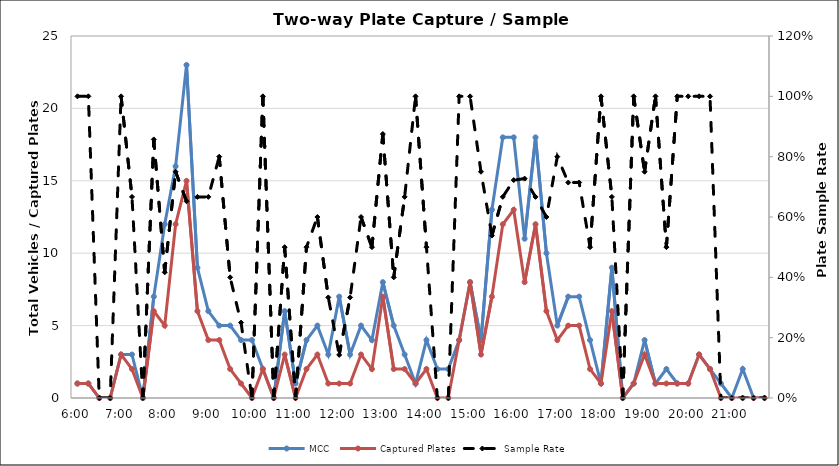
| Category | MCC | Captured Plates |
|---|---|---|
| 0.25 | 1 | 1 |
| 0.260416666666667 | 1 | 1 |
| 0.270833333333333 | 0 | 0 |
| 0.28125 | 0 | 0 |
| 0.291666666666667 | 3 | 3 |
| 0.302083333333333 | 3 | 2 |
| 0.3125 | 0 | 0 |
| 0.322916666666667 | 7 | 6 |
| 0.333333333333333 | 12 | 5 |
| 0.34375 | 16 | 12 |
| 0.354166666666667 | 23 | 15 |
| 0.364583333333333 | 9 | 6 |
| 0.375 | 6 | 4 |
| 0.385416666666667 | 5 | 4 |
| 0.395833333333333 | 5 | 2 |
| 0.40625 | 4 | 1 |
| 0.416666666666667 | 4 | 0 |
| 0.427083333333333 | 2 | 2 |
| 0.4375 | 0 | 0 |
| 0.447916666666667 | 6 | 3 |
| 0.458333333333333 | 1 | 0 |
| 0.46875 | 4 | 2 |
| 0.479166666666667 | 5 | 3 |
| 0.489583333333333 | 3 | 1 |
| 0.5 | 7 | 1 |
| 0.510416666666667 | 3 | 1 |
| 0.520833333333333 | 5 | 3 |
| 0.53125 | 4 | 2 |
| 0.541666666666667 | 8 | 7 |
| 0.552083333333333 | 5 | 2 |
| 0.5625 | 3 | 2 |
| 0.572916666666667 | 1 | 1 |
| 0.583333333333333 | 4 | 2 |
| 0.59375 | 2 | 0 |
| 0.604166666666667 | 2 | 0 |
| 0.614583333333333 | 4 | 4 |
| 0.625 | 8 | 8 |
| 0.635416666666667 | 4 | 3 |
| 0.645833333333333 | 13 | 7 |
| 0.65625 | 18 | 12 |
| 0.666666666666667 | 18 | 13 |
| 0.677083333333333 | 11 | 8 |
| 0.6875 | 18 | 12 |
| 0.697916666666667 | 10 | 6 |
| 0.708333333333333 | 5 | 4 |
| 0.71875 | 7 | 5 |
| 0.729166666666667 | 7 | 5 |
| 0.739583333333333 | 4 | 2 |
| 0.75 | 1 | 1 |
| 0.760416666666667 | 9 | 6 |
| 0.770833333333333 | 0 | 0 |
| 0.78125 | 1 | 1 |
| 0.791666666666667 | 4 | 3 |
| 0.802083333333333 | 1 | 1 |
| 0.8125 | 2 | 1 |
| 0.822916666666667 | 1 | 1 |
| 0.833333333333333 | 1 | 1 |
| 0.84375 | 3 | 3 |
| 0.854166666666667 | 2 | 2 |
| 0.864583333333333 | 1 | 0 |
| 0.875 | 0 | 0 |
| 0.885416666666667 | 2 | 0 |
| 0.895833333333333 | 0 | 0 |
| 0.90625 | 0 | 0 |